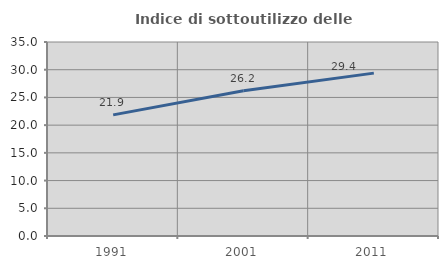
| Category | Indice di sottoutilizzo delle abitazioni  |
|---|---|
| 1991.0 | 21.853 |
| 2001.0 | 26.219 |
| 2011.0 | 29.383 |